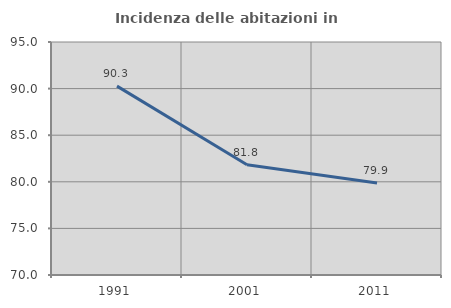
| Category | Incidenza delle abitazioni in proprietà  |
|---|---|
| 1991.0 | 90.262 |
| 2001.0 | 81.835 |
| 2011.0 | 79.868 |